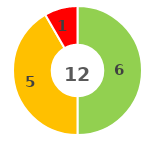
| Category | Series 0 |
|---|---|
| 0 | 0 |
| 1 | 6 |
| 2 | 5 |
| 3 | 1 |
| 4 | 0 |